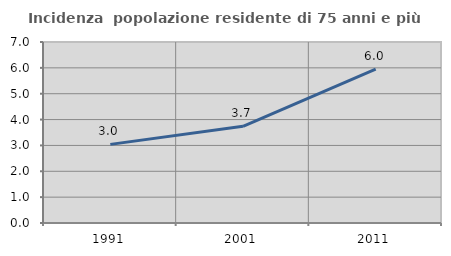
| Category | Incidenza  popolazione residente di 75 anni e più |
|---|---|
| 1991.0 | 3.041 |
| 2001.0 | 3.741 |
| 2011.0 | 5.955 |